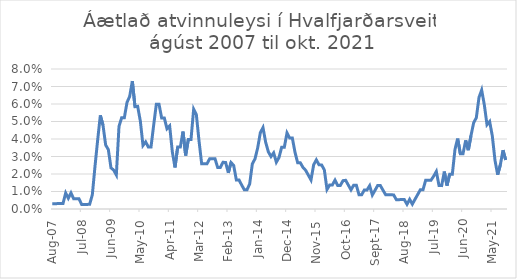
| Category | Áætlað atvinnuleysi |
|---|---|
| 2007-08-01 | 0.003 |
| 2007-09-01 | 0.003 |
| 2007-10-01 | 0.003 |
| 2007-11-01 | 0.003 |
| 2007-12-01 | 0.003 |
| 2008-01-01 | 0.009 |
| 2008-02-01 | 0.006 |
| 2008-03-01 | 0.009 |
| 2008-04-01 | 0.006 |
| 2008-05-01 | 0.006 |
| 2008-06-01 | 0.006 |
| 2008-07-01 | 0.003 |
| 2008-08-01 | 0.003 |
| 2008-09-01 | 0.003 |
| 2008-10-01 | 0.003 |
| 2008-11-01 | 0.008 |
| 2008-12-01 | 0.024 |
| 2009-01-01 | 0.039 |
| 2009-02-01 | 0.054 |
| 2009-03-01 | 0.048 |
| 2009-04-01 | 0.037 |
| 2009-05-01 | 0.034 |
| 2009-06-01 | 0.023 |
| 2009-07-01 | 0.022 |
| 2009-08-01 | 0.019 |
| 2009-09-01 | 0.047 |
| 2009-10-01 | 0.052 |
| 2009-11-01 | 0.052 |
| 2009-12-01 | 0.061 |
| 2010-01-01 | 0.064 |
| 2010-02-01 | 0.073 |
| 2010-03-01 | 0.058 |
| 2010-04-01 | 0.059 |
| 2010-05-01 | 0.05 |
| 2010-06-01 | 0.036 |
| 2010-07-01 | 0.038 |
| 2010-08-01 | 0.035 |
| 2010-09-01 | 0.035 |
| 2010-10-01 | 0.048 |
| 2010-11-01 | 0.06 |
| 2010-12-01 | 0.06 |
| 2011-01-01 | 0.052 |
| 2011-02-01 | 0.052 |
| 2011-03-01 | 0.046 |
| 2011-04-01 | 0.047 |
| 2011-05-01 | 0.033 |
| 2011-06-01 | 0.024 |
| 2011-07-01 | 0.035 |
| 2011-08-01 | 0.035 |
| 2011-09-01 | 0.044 |
| 2011-10-01 | 0.031 |
| 2011-11-01 | 0.04 |
| 2011-12-01 | 0.04 |
| 2012-01-01 | 0.057 |
| 2012-02-01 | 0.054 |
| 2012-03-01 | 0.039 |
| 2012-04-01 | 0.026 |
| 2012-05-01 | 0.026 |
| 2012-06-01 | 0.026 |
| 2012-07-01 | 0.029 |
| 2012-08-01 | 0.029 |
| 2012-09-01 | 0.029 |
| 2012-10-01 | 0.024 |
| 2012-11-01 | 0.024 |
| 2012-12-01 | 0.027 |
| 2013-01-01 | 0.027 |
| 2013-02-01 | 0.021 |
| 2013-03-01 | 0.027 |
| 2013-04-01 | 0.025 |
| 2013-05-01 | 0.017 |
| 2013-06-01 | 0.017 |
| 2013-07-01 | 0.014 |
| 2013-08-01 | 0.011 |
| 2013-09-01 | 0.011 |
| 2013-10-01 | 0.014 |
| 2013-11-01 | 0.026 |
| 2013-12-01 | 0.029 |
| 2014-01-01 | 0.035 |
| 2014-02-01 | 0.044 |
| 2014-03-01 | 0.047 |
| 2014-04-01 | 0.038 |
| 2014-05-01 | 0.033 |
| 2014-06-01 | 0.03 |
| 2014-07-01 | 0.032 |
| 2014-08-01 | 0.027 |
| 2014-09-01 | 0.029 |
| 2014-10-01 | 0.035 |
| 2014-11-01 | 0.035 |
| 2014-12-01 | 0.043 |
| 2015-01-01 | 0.041 |
| 2015-02-01 | 0.041 |
| 2015-03-01 | 0.032 |
| 2015-04-01 | 0.026 |
| 2015-05-01 | 0.026 |
| 2015-06-01 | 0.024 |
| 2015-07-01 | 0.022 |
| 2015-08-01 | 0.019 |
| 2015-09-01 | 0.017 |
| 2015-10-01 | 0.025 |
| 2015-11-01 | 0.028 |
| 2015-12-01 | 0.025 |
| 2016-01-01 | 0.025 |
| 2016-02-01 | 0.022 |
| 2016-03-01 | 0.011 |
| 2016-04-01 | 0.014 |
| 2016-05-01 | 0.014 |
| 2016-06-01 | 0.016 |
| 2016-07-01 | 0.013 |
| 2016-08-01 | 0.013 |
| 2016-09-01 | 0.016 |
| 2016-10-01 | 0.016 |
| 2016-11-01 | 0.014 |
| 2016-12-01 | 0.011 |
| 2017-01-01 | 0.014 |
| 2017-02-01 | 0.014 |
| 2017-03-01 | 0.008 |
| 2017-04-01 | 0.008 |
| 2017-05-01 | 0.011 |
| 2017-06-01 | 0.011 |
| 2017-07-01 | 0.013 |
| 2017-08-01 | 0.008 |
| 2017-09-01 | 0.011 |
| 2017-10-01 | 0.013 |
| 2017-11-01 | 0.013 |
| 2017-12-01 | 0.011 |
| 2018-01-01 | 0.008 |
| 2018-02-01 | 0.008 |
| 2018-03-01 | 0.008 |
| 2018-04-01 | 0.008 |
| 2018-05-01 | 0.005 |
| 2018-06-01 | 0.005 |
| 2018-07-01 | 0.005 |
| 2018-08-01 | 0.005 |
| 2018-09-01 | 0.003 |
| 2018-10-01 | 0.006 |
| 2018-11-01 | 0.003 |
| 2018-12-01 | 0.006 |
| 2019-01-01 | 0.008 |
| 2019-02-01 | 0.011 |
| 2019-03-01 | 0.011 |
| 2019-04-01 | 0.016 |
| 2019-05-01 | 0.016 |
| 2019-06-01 | 0.016 |
| 2019-07-01 | 0.019 |
| 2019-08-01 | 0.021 |
| 2019-09-01 | 0.013 |
| 2019-10-01 | 0.013 |
| 2019-11-01 | 0.021 |
| 2019-12-01 | 0.013 |
| 2020-01-01 | 0.02 |
| 2020-02-01 | 0.02 |
| 2020-03-01 | 0.034 |
| 2020-04-01 | 0.04 |
| 2020-05-01 | 0.032 |
| 2020-06-01 | 0.032 |
| 2020-07-01 | 0.039 |
| 2020-08-01 | 0.034 |
| 2020-09-01 | 0.042 |
| 2020-10-01 | 0.049 |
| 2020-11-01 | 0.052 |
| 2020-12-01 | 0.064 |
| 2021-01-01 | 0.068 |
| 2021-02-01 | 0.059 |
| 2021-03-01 | 0.048 |
| 2021-04-01 | 0.05 |
| 2021-05-01 | 0.042 |
| 2021-06-01 | 0.028 |
| 2021-07-01 | 0.02 |
| 2021-08-01 | 0.025 |
| 2021-09-01 | 0.034 |
| 2021-10-01 | 0.028 |